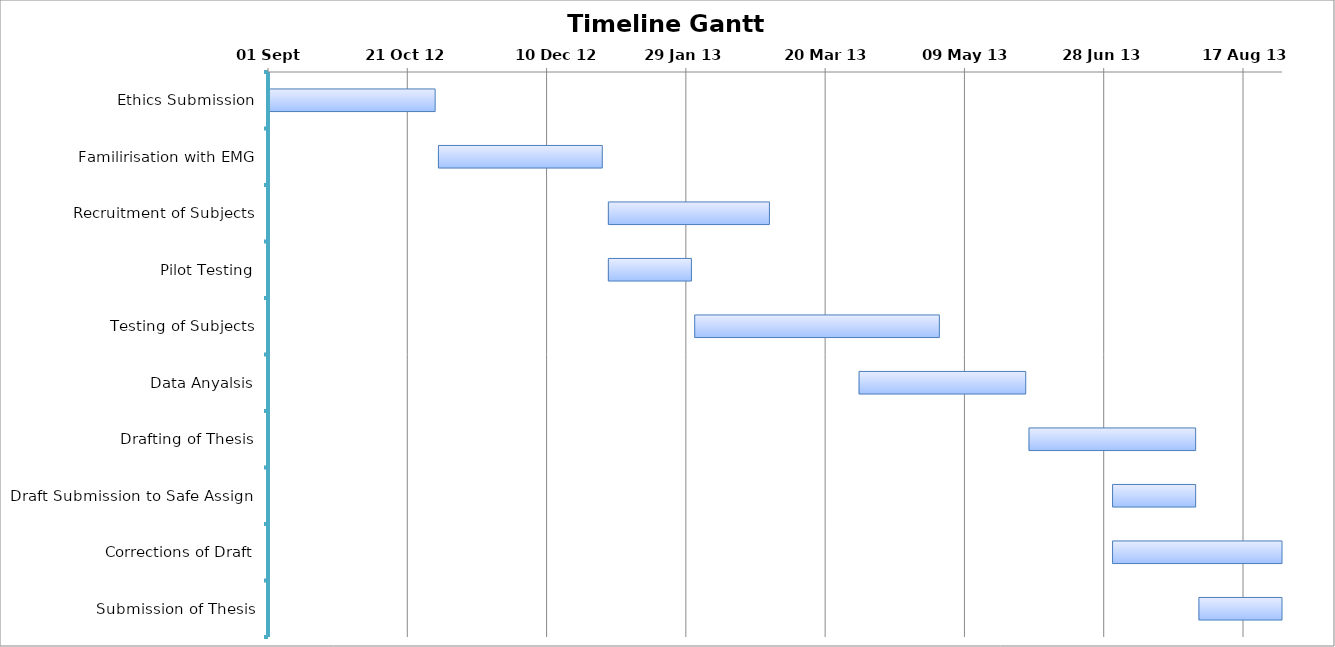
| Category | Start Date | Completed  |
|---|---|---|
| Ethics Submission | 2012-09-01 | 60 |
| Familirisation with EMG | 2012-11-01 | 59 |
| Recruitment of Subjects | 2013-01-01 | 58 |
| Pilot Testing | 2013-01-01 | 30 |
| Testing of Subjects | 2013-02-01 | 88 |
| Data Anyalsis | 2013-04-01 | 60 |
| Drafting of Thesis | 2013-06-01 | 60 |
| Draft Submission to Safe Assign  | 2013-07-01 | 30 |
| Corrections of Draft | 2013-07-01 | 61 |
| Submission of Thesis | 2013-08-01 | 30 |